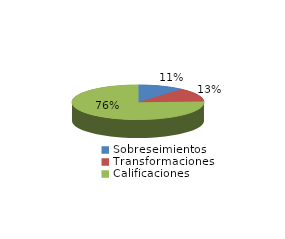
| Category | Series 0 |
|---|---|
| Sobreseimientos | 781 |
| Transformaciones | 893 |
| Calificaciones | 5188 |